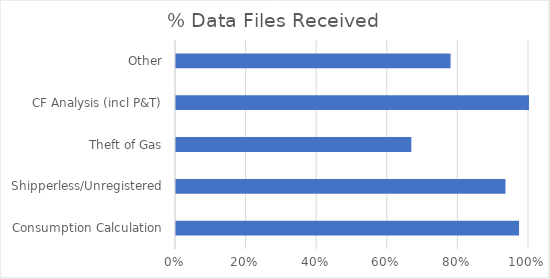
| Category | % Data Received |
|---|---|
| Consumption Calculation | 0.972 |
| Shipperless/Unregistered | 0.933 |
| Theft of Gas | 0.667 |
| CF Analysis (incl P&T) | 1 |
| Other | 0.778 |